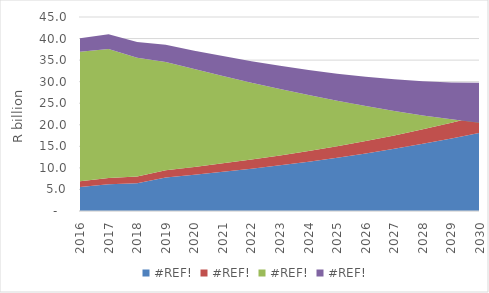
| Category | #REF! |
|---|---|
| 2016.0 | 3.15 |
| 2017.0 | 3.402 |
| 2018.0 | 3.674 |
| 2019.0 | 3.968 |
| 2020.0 | 4.286 |
| 2021.0 | 4.628 |
| 2022.0 | 4.999 |
| 2023.0 | 5.399 |
| 2024.0 | 5.83 |
| 2025.0 | 6.297 |
| 2026.0 | 6.801 |
| 2027.0 | 7.345 |
| 2028.0 | 7.932 |
| 2029.0 | 8.567 |
| 2030.0 | 9.252 |